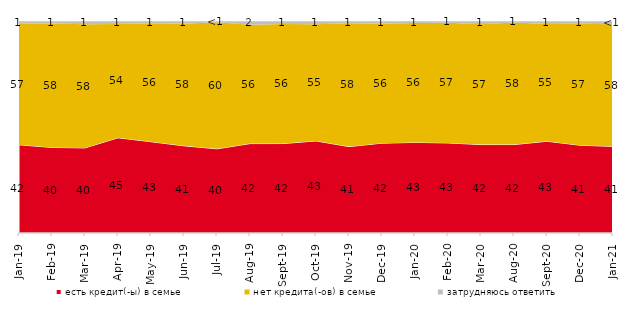
| Category | есть кредит(-ы) в семье | нет кредита(-ов) в семье | затрудняюсь ответить |
|---|---|---|---|
| 2019-01-01 | 41.65 | 57.3 | 1.05 |
| 2019-02-01 | 40.4 | 58.45 | 1.15 |
| 2019-03-01 | 40.179 | 58.379 | 1.442 |
| 2019-04-01 | 44.95 | 53.762 | 1.287 |
| 2019-05-01 | 43.091 | 55.968 | 0.941 |
| 2019-06-01 | 41.147 | 57.656 | 1.197 |
| 2019-07-01 | 39.752 | 59.752 | 0.495 |
| 2019-08-01 | 42.208 | 56.144 | 1.648 |
| 2019-09-01 | 42.228 | 56.485 | 1.287 |
| 2019-10-01 | 43.465 | 55.099 | 1.436 |
| 2019-11-01 | 40.792 | 58.218 | 0.99 |
| 2019-12-01 | 42.426 | 56.386 | 1.188 |
| 2020-01-01 | 42.772 | 56.337 | 0.891 |
| 2020-02-01 | 42.525 | 56.782 | 0.693 |
| 2020-03-01 | 41.745 | 56.817 | 1.438 |
| 2020-08-01 | 41.758 | 57.597 | 0.645 |
| 2020-09-01 | 43.305 | 55.351 | 1.344 |
| 2020-12-01 | 41.448 | 57.362 | 1.19 |
| 2021-01-01 | 40.884 | 57.625 | 1.49 |